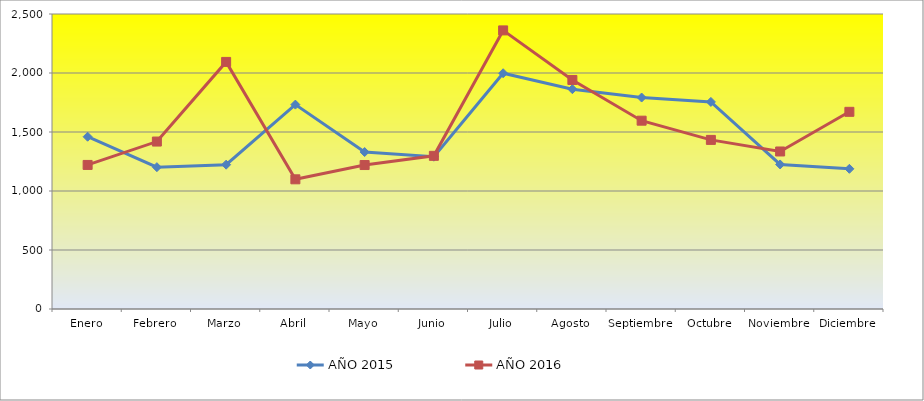
| Category | AÑO 2015 | AÑO 2016 |
|---|---|---|
| Enero | 1460 | 1221 |
| Febrero | 1202 | 1419 |
| Marzo | 1223 | 2094 |
| Abril | 1732 | 1099 |
| Mayo | 1330 | 1220 |
| Junio | 1291 | 1298 |
| Julio | 1998 | 2361 |
| Agosto | 1863 | 1941 |
| Septiembre | 1792 | 1596 |
| Octubre | 1755 | 1433 |
| Noviembre | 1225 | 1335 |
| Diciembre | 1188 | 1671 |